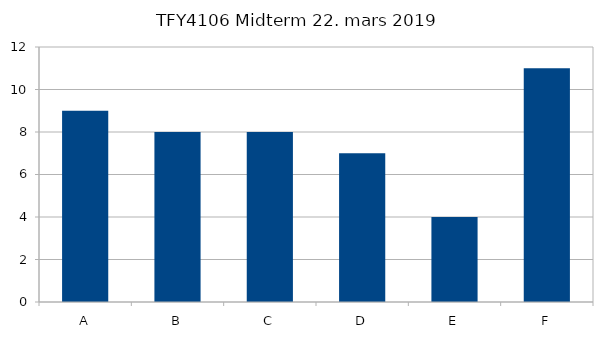
| Category | Series 0 |
|---|---|
| A | 9 |
| B | 8 |
| C | 8 |
| D | 7 |
| E | 4 |
| F | 11 |